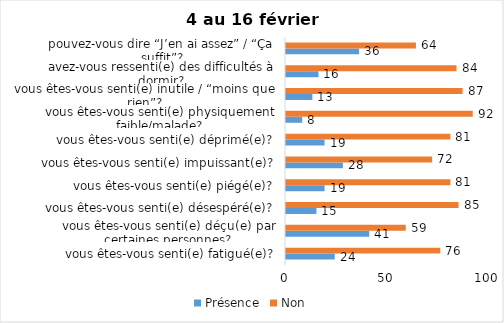
| Category | Présence | Non |
|---|---|---|
| vous êtes-vous senti(e) fatigué(e)? | 24 | 76 |
| vous êtes-vous senti(e) déçu(e) par certaines personnes? | 41 | 59 |
| vous êtes-vous senti(e) désespéré(e)? | 15 | 85 |
| vous êtes-vous senti(e) piégé(e)? | 19 | 81 |
| vous êtes-vous senti(e) impuissant(e)? | 28 | 72 |
| vous êtes-vous senti(e) déprimé(e)? | 19 | 81 |
| vous êtes-vous senti(e) physiquement faible/malade? | 8 | 92 |
| vous êtes-vous senti(e) inutile / “moins que rien”? | 13 | 87 |
| avez-vous ressenti(e) des difficultés à dormir? | 16 | 84 |
| pouvez-vous dire “J’en ai assez” / “Ça suffit”? | 36 | 64 |